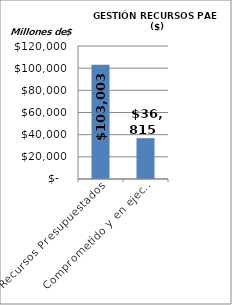
| Category | Series 0 |
|---|---|
| Recursos Presupuestados | 103003.357 |
| Comprometido y en ejecución  | 36814.572 |